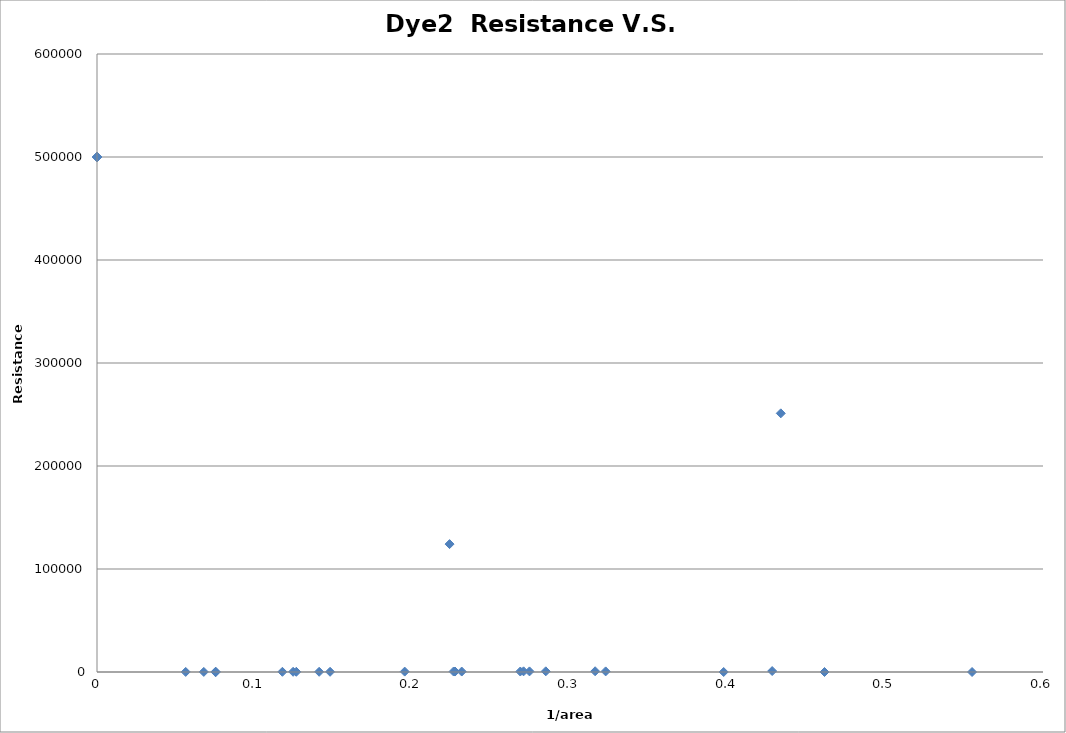
| Category | Series 0 |
|---|---|
| 0.0 | 500000 |
| 0.555000555000555 | 0 |
| 0.0 | 500000 |
| 0.0 | 500000 |
| 0.0 | 500000 |
| 0.46142488002953125 | 0 |
| 0.31593580184506515 | 710.145 |
| 0.42822884549503254 | 916.84 |
| 0.39747207758654957 | 0 |
| 0.4336889582791223 | 251125 |
| 0.27430326969497476 | 585.923 |
| 0.2313315443693902 | 441.95 |
| 0.32261186566441913 | 581.828 |
| 0.27056277056277056 | 638.205 |
| 0.2846326815244926 | 658.738 |
| 0.22616759018432653 | 463.34 |
| 0.19516003122560502 | 382.97 |
| 0.26846358291497757 | 464.359 |
| 0.22361859612245355 | 124169.852 |
| 0.22708692887637388 | 448.06 |
| 0.12439667612081405 | 197.795 |
| 0.11759310434036148 | 191.747 |
| 0.1409046075806679 | 210.904 |
| 0.14782840079236023 | 210.904 |
| 0.12640307412276267 | 197.795 |
| 0.06774149844194555 | 86.151 |
| 0.05625246104517073 | 73.109 |
| 0.07543298533582765 | 90.166 |
| 0.07512696457012351 | 0 |
| 0.07512696457012351 | 89.162 |